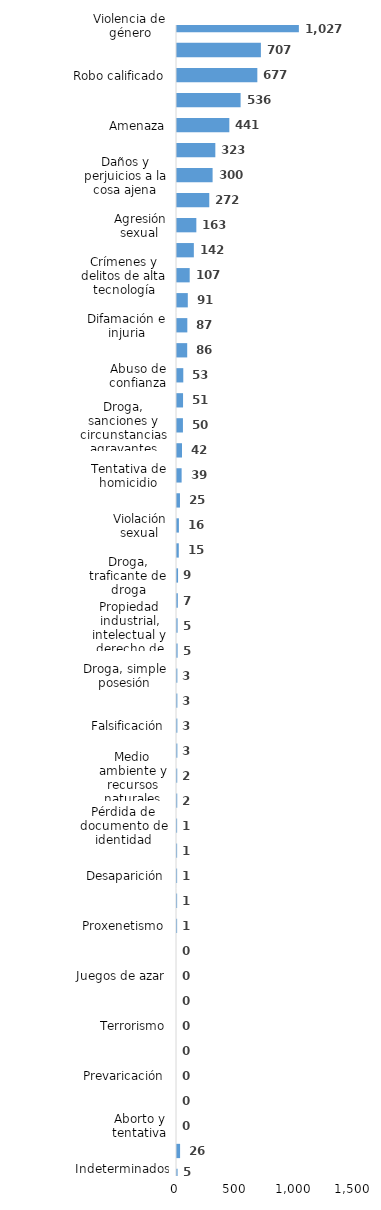
| Category | Series 0 |
|---|---|
| Violencia de género | 1027 |
| Golpes y heridas | 707 |
| Robo calificado | 677 |
| Ley de armas | 536 |
| Amenaza | 441 |
| Violencia intrafamiliar | 323 |
| Daños y perjuicios a la cosa ajena | 300 |
| Asociación de malhechores | 272 |
| Agresión sexual | 163 |
| Código del menor NNA | 142 |
| Crímenes y delitos de alta tecnología | 107 |
| Código de trabajo | 91 |
| Difamación e injuria | 87 |
| Conflictos sociales | 86 |
| Abuso de confianza | 53 |
| Estafa | 51 |
| Droga, sanciones y circunstancias agravantes | 50 |
| Droga, distribución de droga | 42 |
| Tentativa de homicidio | 39 |
| Robo simple | 25 |
| Violación sexual | 16 |
| Protección animal y tenencia responsable | 15 |
| Droga, traficante de droga | 9 |
| Crímenes y delitos contra la propiedad | 7 |
| Propiedad industrial, intelectual y derecho de autor | 5 |
| Tráfico ilícito de migrantes y trata de personas | 5 |
| Droga, simple posesión | 3 |
| Homicidio | 3 |
| Falsificación | 3 |
| Secuestro | 3 |
| Medio ambiente y recursos naturales | 2 |
| Contra el lavado de activos  | 2 |
| Pérdida de documento de identidad | 1 |
| Tránsito y seguridad vial  | 1 |
| Desaparición | 1 |
| Derechos humanos | 1 |
| Proxenetismo | 1 |
| Ley general de salud | 0 |
| Juegos de azar | 0 |
| Ley de cheques | 0 |
| Terrorismo | 0 |
| Soborno | 0 |
| Prevaricación | 0 |
| Droga, delitos y sanciones | 0 |
| Aborto y tentativa | 0 |
| Otros | 26 |
| Indeterminados | 5 |